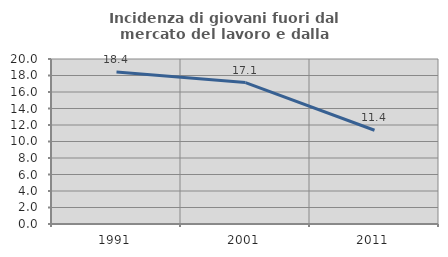
| Category | Incidenza di giovani fuori dal mercato del lavoro e dalla formazione  |
|---|---|
| 1991.0 | 18.421 |
| 2001.0 | 17.143 |
| 2011.0 | 11.364 |